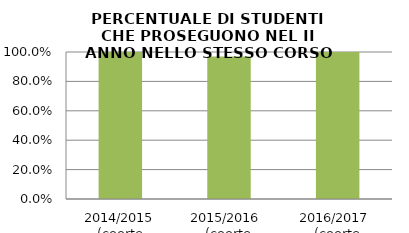
| Category | 2014/2015 (coorte 2013/14) 2015/2016  (coorte 2014/15) 2016/2017  (coorte 2015/16) |
|---|---|
| 2014/2015 (coorte 2013/14) | 1 |
| 2015/2016  (coorte 2014/15) | 0.969 |
| 2016/2017  (coorte 2015/16) | 1 |